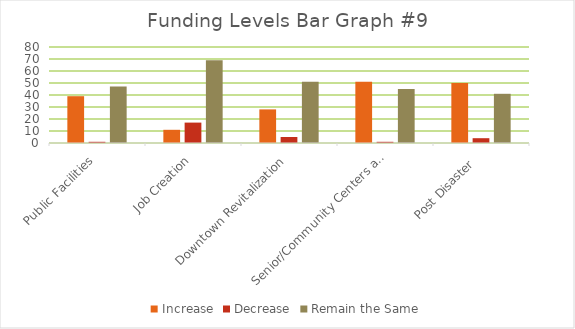
| Category | Increase | Decrease | Remain the Same |
|---|---|---|---|
| Public Facilities | 39 | 1 | 47 |
| Job Creation | 11 | 17 | 69 |
| Downtown Revitalization | 28 | 5 | 51 |
| Senior/Community Centers and Parks | 51 | 1 | 45 |
| Post Disaster  | 50 | 4 | 41 |